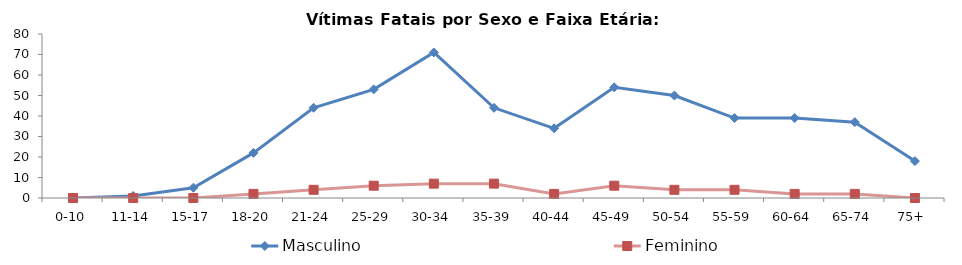
| Category | Masculino | Feminino |
|---|---|---|
| 0-10 | 0 | 0 |
| 11-14 | 1 | 0 |
| 15-17 | 5 | 0 |
| 18-20 | 22 | 2 |
| 21-24 | 44 | 4 |
| 25-29 | 53 | 6 |
| 30-34 | 71 | 7 |
| 35-39 | 44 | 7 |
| 40-44 | 34 | 2 |
| 45-49 | 54 | 6 |
| 50-54 | 50 | 4 |
| 55-59 | 39 | 4 |
| 60-64 | 39 | 2 |
| 65-74 | 37 | 2 |
| 75+ | 18 | 0 |